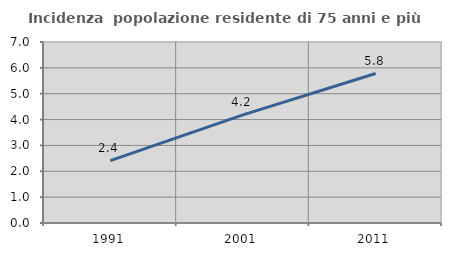
| Category | Incidenza  popolazione residente di 75 anni e più |
|---|---|
| 1991.0 | 2.413 |
| 2001.0 | 4.182 |
| 2011.0 | 5.781 |